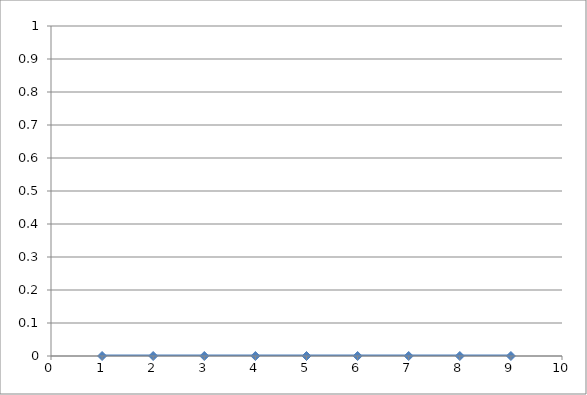
| Category | Series 0 |
|---|---|
| 0.0 | 0 |
| 0.0 | 0 |
| 0.0 | 0 |
| 0.0 | 0 |
| 0.0 | 0 |
| 0.0 | 0 |
| 0.0 | 0 |
| 0.0 | 0 |
| 0.0 | 0 |